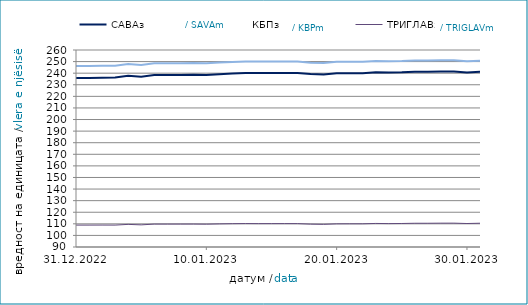
| Category | САВАз | КБПз | ТРИГЛАВз |
|---|---|---|---|
| 2022-12-31 | 235.844 | 246.232 | 108.892 |
| 2023-01-01 | 235.856 | 246.246 | 108.897 |
| 2023-01-02 | 236.052 | 246.304 | 108.921 |
| 2023-01-03 | 236.356 | 246.437 | 108.903 |
| 2023-01-04 | 237.863 | 247.996 | 109.517 |
| 2023-01-05 | 236.856 | 246.985 | 109.103 |
| 2023-01-06 | 238.334 | 248.513 | 109.758 |
| 2023-01-07 | 238.346 | 248.527 | 109.763 |
| 2023-01-08 | 238.359 | 248.54 | 109.769 |
| 2023-01-09 | 238.7 | 248.796 | 109.788 |
| 2023-01-10 | 238.501 | 248.593 | 109.699 |
| 2023-01-11 | 239.093 | 249.145 | 109.946 |
| 2023-01-12 | 239.75 | 249.692 | 110.118 |
| 2023-01-13 | 240.152 | 250.048 | 110.234 |
| 2023-01-14 | 240.101 | 249.971 | 110.168 |
| 2023-01-15 | 240.113 | 249.985 | 110.174 |
| 2023-01-16 | 240.184 | 250.023 | 110.192 |
| 2023-01-17 | 240.081 | 250.045 | 110.173 |
| 2023-01-18 | 239.32 | 249.09 | 109.714 |
| 2023-01-19 | 238.876 | 248.76 | 109.541 |
| 2023-01-20 | 239.924 | 249.81 | 109.972 |
| 2023-01-21 | 240.005 | 249.904 | 110.011 |
| 2023-01-22 | 240.017 | 249.918 | 110.016 |
| 2023-01-23 | 240.865 | 250.592 | 110.324 |
| 2023-01-24 | 240.611 | 250.256 | 110.193 |
| 2023-01-25 | 240.703 | 250.405 | 110.287 |
| 2023-01-26 | 241.194 | 250.878 | 110.488 |
| 2023-01-27 | 241.255 | 250.868 | 110.485 |
| 2023-01-28 | 241.438 | 251.069 | 110.572 |
| 2023-01-29 | 241.451 | 251.082 | 110.577 |
| 2023-01-30 | 240.616 | 250.323 | 110.26 |
| 2023-01-31 | 241.163 | 250.812 | 110.512 |